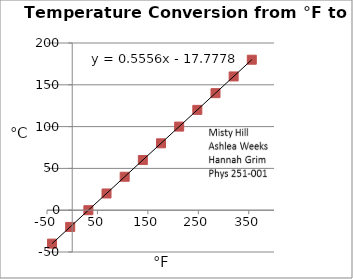
| Category | Temperature Conversion from F to C |
|---|---|
| -40.0 | -40 |
| -4.0 | -20 |
| 32.0 | 0 |
| 68.0 | 20 |
| 104.0 | 40 |
| 140.0 | 60 |
| 176.0 | 80 |
| 212.0 | 100 |
| 248.0 | 120 |
| 284.0 | 140 |
| 320.0 | 160 |
| 356.0 | 180 |